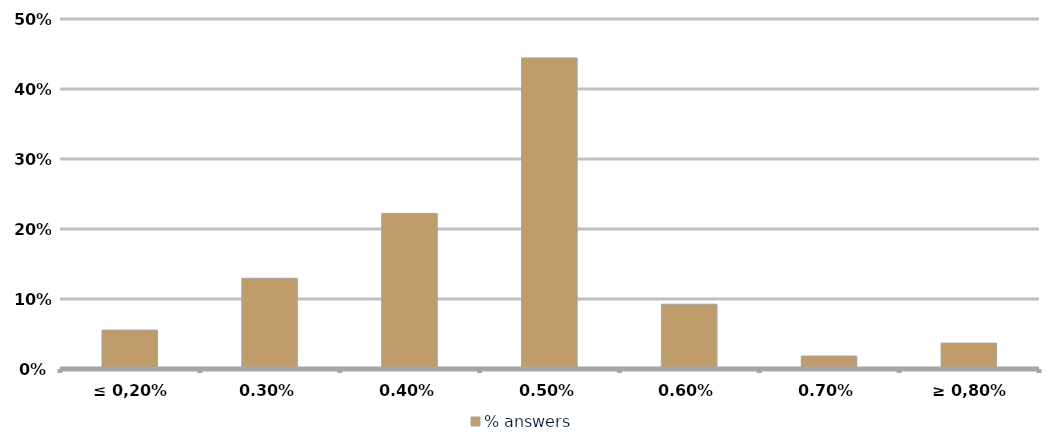
| Category | % answers |
|---|---|
| ≤ 0,20% | 0.056 |
| 0,30% | 0.13 |
| 0,40% | 0.222 |
| 0,50% | 0.444 |
| 0,60% | 0.093 |
| 0,70% | 0.019 |
| ≥ 0,80% | 0.037 |